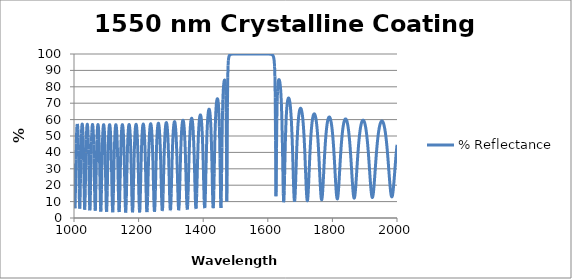
| Category | % Reflectance |
|---|---|
| 1000.0 | 32.933 |
| 1001.0 | 20.447 |
| 1002.0 | 9.538 |
| 1003.0 | 5.943 |
| 1004.0 | 12.063 |
| 1005.0 | 23.858 |
| 1006.0 | 35.874 |
| 1007.0 | 45.386 |
| 1008.0 | 51.915 |
| 1009.0 | 55.778 |
| 1010.0 | 57.343 |
| 1011.0 | 56.794 |
| 1012.0 | 54.082 |
| 1013.0 | 48.941 |
| 1014.0 | 41.01 |
| 1015.0 | 30.245 |
| 1016.0 | 17.946 |
| 1017.0 | 8.01 |
| 1018.0 | 5.721 |
| 1019.0 | 12.536 |
| 1020.0 | 24.26 |
| 1021.0 | 35.853 |
| 1022.0 | 45.064 |
| 1023.0 | 51.483 |
| 1024.0 | 55.394 |
| 1025.0 | 57.14 |
| 1026.0 | 56.908 |
| 1027.0 | 54.684 |
| 1028.0 | 50.263 |
| 1029.0 | 43.315 |
| 1030.0 | 33.656 |
| 1031.0 | 21.947 |
| 1032.0 | 10.844 |
| 1033.0 | 5.084 |
| 1034.0 | 8.019 |
| 1035.0 | 17.8 |
| 1036.0 | 29.614 |
| 1037.0 | 40.023 |
| 1038.0 | 47.848 |
| 1039.0 | 53.104 |
| 1040.0 | 56.118 |
| 1041.0 | 57.165 |
| 1042.0 | 56.388 |
| 1043.0 | 53.722 |
| 1044.0 | 48.94 |
| 1045.0 | 41.743 |
| 1046.0 | 32.031 |
| 1047.0 | 20.577 |
| 1048.0 | 10.005 |
| 1049.0 | 4.666 |
| 1050.0 | 7.494 |
| 1051.0 | 16.814 |
| 1052.0 | 28.268 |
| 1053.0 | 38.595 |
| 1054.0 | 46.56 |
| 1055.0 | 52.089 |
| 1056.0 | 55.464 |
| 1057.0 | 56.961 |
| 1058.0 | 56.723 |
| 1059.0 | 54.738 |
| 1060.0 | 50.843 |
| 1061.0 | 44.817 |
| 1062.0 | 36.427 |
| 1063.0 | 25.923 |
| 1064.0 | 14.794 |
| 1065.0 | 6.36 |
| 1066.0 | 4.477 |
| 1067.0 | 10.14 |
| 1068.0 | 20.407 |
| 1069.0 | 31.395 |
| 1070.0 | 40.797 |
| 1071.0 | 47.904 |
| 1072.0 | 52.787 |
| 1073.0 | 55.721 |
| 1074.0 | 56.937 |
| 1075.0 | 56.548 |
| 1076.0 | 54.527 |
| 1077.0 | 50.721 |
| 1078.0 | 44.885 |
| 1079.0 | 36.818 |
| 1080.0 | 26.712 |
| 1081.0 | 15.874 |
| 1082.0 | 7.075 |
| 1083.0 | 3.915 |
| 1084.0 | 7.968 |
| 1085.0 | 17.177 |
| 1086.0 | 27.933 |
| 1087.0 | 37.666 |
| 1088.0 | 45.359 |
| 1089.0 | 50.909 |
| 1090.0 | 54.534 |
| 1091.0 | 56.475 |
| 1092.0 | 56.888 |
| 1093.0 | 55.812 |
| 1094.0 | 53.173 |
| 1095.0 | 48.79 |
| 1096.0 | 42.435 |
| 1097.0 | 33.994 |
| 1098.0 | 23.842 |
| 1099.0 | 13.452 |
| 1100.0 | 5.725 |
| 1101.0 | 3.783 |
| 1102.0 | 8.146 |
| 1103.0 | 16.876 |
| 1104.0 | 26.977 |
| 1105.0 | 36.284 |
| 1106.0 | 43.854 |
| 1107.0 | 49.526 |
| 1108.0 | 53.452 |
| 1109.0 | 55.839 |
| 1110.0 | 56.848 |
| 1111.0 | 56.555 |
| 1112.0 | 54.946 |
| 1113.0 | 51.92 |
| 1114.0 | 47.308 |
| 1115.0 | 40.927 |
| 1116.0 | 32.731 |
| 1117.0 | 23.121 |
| 1118.0 | 13.395 |
| 1119.0 | 5.96 |
| 1120.0 | 3.483 |
| 1121.0 | 7.003 |
| 1122.0 | 15.013 |
| 1123.0 | 24.778 |
| 1124.0 | 34.108 |
| 1125.0 | 41.927 |
| 1126.0 | 47.958 |
| 1127.0 | 52.291 |
| 1128.0 | 55.118 |
| 1129.0 | 56.605 |
| 1130.0 | 56.854 |
| 1131.0 | 55.888 |
| 1132.0 | 53.651 |
| 1133.0 | 50.014 |
| 1134.0 | 44.807 |
| 1135.0 | 37.893 |
| 1136.0 | 29.348 |
| 1137.0 | 19.786 |
| 1138.0 | 10.741 |
| 1139.0 | 4.626 |
| 1140.0 | 3.651 |
| 1141.0 | 8.192 |
| 1142.0 | 16.478 |
| 1143.0 | 26.003 |
| 1144.0 | 34.922 |
| 1145.0 | 42.365 |
| 1146.0 | 48.128 |
| 1147.0 | 52.304 |
| 1148.0 | 55.069 |
| 1149.0 | 56.576 |
| 1150.0 | 56.922 |
| 1151.0 | 56.132 |
| 1152.0 | 54.166 |
| 1153.0 | 50.915 |
| 1154.0 | 46.229 |
| 1155.0 | 39.964 |
| 1156.0 | 32.114 |
| 1157.0 | 23.052 |
| 1158.0 | 13.869 |
| 1159.0 | 6.53 |
| 1160.0 | 3.306 |
| 1161.0 | 5.392 |
| 1162.0 | 11.967 |
| 1163.0 | 20.867 |
| 1164.0 | 30 |
| 1165.0 | 38.106 |
| 1166.0 | 44.696 |
| 1167.0 | 49.725 |
| 1168.0 | 53.321 |
| 1169.0 | 55.644 |
| 1170.0 | 56.822 |
| 1171.0 | 56.927 |
| 1172.0 | 55.969 |
| 1173.0 | 53.9 |
| 1174.0 | 50.615 |
| 1175.0 | 45.975 |
| 1176.0 | 39.851 |
| 1177.0 | 32.244 |
| 1178.0 | 23.491 |
| 1179.0 | 14.556 |
| 1180.0 | 7.182 |
| 1181.0 | 3.458 |
| 1182.0 | 4.671 |
| 1183.0 | 10.359 |
| 1184.0 | 18.679 |
| 1185.0 | 27.622 |
| 1186.0 | 35.837 |
| 1187.0 | 42.711 |
| 1188.0 | 48.108 |
| 1189.0 | 52.11 |
| 1190.0 | 54.864 |
| 1191.0 | 56.501 |
| 1192.0 | 57.111 |
| 1193.0 | 56.733 |
| 1194.0 | 55.35 |
| 1195.0 | 52.895 |
| 1196.0 | 49.257 |
| 1197.0 | 44.304 |
| 1198.0 | 37.944 |
| 1199.0 | 30.238 |
| 1200.0 | 21.615 |
| 1201.0 | 13.109 |
| 1202.0 | 6.42 |
| 1203.0 | 3.414 |
| 1204.0 | 5.082 |
| 1205.0 | 10.838 |
| 1206.0 | 18.954 |
| 1207.0 | 27.616 |
| 1208.0 | 35.601 |
| 1209.0 | 42.342 |
| 1210.0 | 47.7 |
| 1211.0 | 51.74 |
| 1212.0 | 54.593 |
| 1213.0 | 56.384 |
| 1214.0 | 57.204 |
| 1215.0 | 57.097 |
| 1216.0 | 56.064 |
| 1217.0 | 54.056 |
| 1218.0 | 50.985 |
| 1219.0 | 46.734 |
| 1220.0 | 41.194 |
| 1221.0 | 34.338 |
| 1222.0 | 26.364 |
| 1223.0 | 17.902 |
| 1224.0 | 10.184 |
| 1225.0 | 4.913 |
| 1226.0 | 3.6 |
| 1227.0 | 6.656 |
| 1228.0 | 13.113 |
| 1229.0 | 21.27 |
| 1230.0 | 29.588 |
| 1231.0 | 37.107 |
| 1232.0 | 43.412 |
| 1233.0 | 48.422 |
| 1234.0 | 52.212 |
| 1235.0 | 54.903 |
| 1236.0 | 56.607 |
| 1237.0 | 57.407 |
| 1238.0 | 57.344 |
| 1239.0 | 56.419 |
| 1240.0 | 54.59 |
| 1241.0 | 51.782 |
| 1242.0 | 47.89 |
| 1243.0 | 42.809 |
| 1244.0 | 36.487 |
| 1245.0 | 29.034 |
| 1246.0 | 20.888 |
| 1247.0 | 12.989 |
| 1248.0 | 6.782 |
| 1249.0 | 3.816 |
| 1250.0 | 4.963 |
| 1251.0 | 9.86 |
| 1252.0 | 17.16 |
| 1253.0 | 25.299 |
| 1254.0 | 33.106 |
| 1255.0 | 39.944 |
| 1256.0 | 45.586 |
| 1257.0 | 50.028 |
| 1258.0 | 53.362 |
| 1259.0 | 55.702 |
| 1260.0 | 57.144 |
| 1261.0 | 57.753 |
| 1262.0 | 57.56 |
| 1263.0 | 56.561 |
| 1264.0 | 54.713 |
| 1265.0 | 51.943 |
| 1266.0 | 48.154 |
| 1267.0 | 43.248 |
| 1268.0 | 37.176 |
| 1269.0 | 30.024 |
| 1270.0 | 22.16 |
| 1271.0 | 14.384 |
| 1272.0 | 7.97 |
| 1273.0 | 4.37 |
| 1274.0 | 4.568 |
| 1275.0 | 8.499 |
| 1276.0 | 15.095 |
| 1277.0 | 22.9 |
| 1278.0 | 30.695 |
| 1279.0 | 37.736 |
| 1280.0 | 43.696 |
| 1281.0 | 48.51 |
| 1282.0 | 52.238 |
| 1283.0 | 54.983 |
| 1284.0 | 56.842 |
| 1285.0 | 57.893 |
| 1286.0 | 58.182 |
| 1287.0 | 57.726 |
| 1288.0 | 56.506 |
| 1289.0 | 54.474 |
| 1290.0 | 51.555 |
| 1291.0 | 47.656 |
| 1292.0 | 42.688 |
| 1293.0 | 36.618 |
| 1294.0 | 29.55 |
| 1295.0 | 21.86 |
| 1296.0 | 14.326 |
| 1297.0 | 8.15 |
| 1298.0 | 4.677 |
| 1299.0 | 4.816 |
| 1300.0 | 8.526 |
| 1301.0 | 14.842 |
| 1302.0 | 22.416 |
| 1303.0 | 30.077 |
| 1304.0 | 37.086 |
| 1305.0 | 43.096 |
| 1306.0 | 48.018 |
| 1307.0 | 51.894 |
| 1308.0 | 54.816 |
| 1309.0 | 56.88 |
| 1310.0 | 58.164 |
| 1311.0 | 58.724 |
| 1312.0 | 58.582 |
| 1313.0 | 57.736 |
| 1314.0 | 56.152 |
| 1315.0 | 53.771 |
| 1316.0 | 50.512 |
| 1317.0 | 46.282 |
| 1318.0 | 41.011 |
| 1319.0 | 34.7 |
| 1320.0 | 27.518 |
| 1321.0 | 19.925 |
| 1322.0 | 12.783 |
| 1323.0 | 7.306 |
| 1324.0 | 4.717 |
| 1325.0 | 5.693 |
| 1326.0 | 9.976 |
| 1327.0 | 16.528 |
| 1328.0 | 24.068 |
| 1329.0 | 31.553 |
| 1330.0 | 38.344 |
| 1331.0 | 44.153 |
| 1332.0 | 48.916 |
| 1333.0 | 52.683 |
| 1334.0 | 55.543 |
| 1335.0 | 57.588 |
| 1336.0 | 58.893 |
| 1337.0 | 59.511 |
| 1338.0 | 59.468 |
| 1339.0 | 58.764 |
| 1340.0 | 57.37 |
| 1341.0 | 55.233 |
| 1342.0 | 52.277 |
| 1343.0 | 48.414 |
| 1344.0 | 43.558 |
| 1345.0 | 37.676 |
| 1346.0 | 30.852 |
| 1347.0 | 23.404 |
| 1348.0 | 16.004 |
| 1349.0 | 9.715 |
| 1350.0 | 5.79 |
| 1351.0 | 5.194 |
| 1352.0 | 8.096 |
| 1353.0 | 13.772 |
| 1354.0 | 21.004 |
| 1355.0 | 28.62 |
| 1356.0 | 35.802 |
| 1357.0 | 42.117 |
| 1358.0 | 47.415 |
| 1359.0 | 51.701 |
| 1360.0 | 55.052 |
| 1361.0 | 57.563 |
| 1362.0 | 59.321 |
| 1363.0 | 60.391 |
| 1364.0 | 60.818 |
| 1365.0 | 60.617 |
| 1366.0 | 59.781 |
| 1367.0 | 58.274 |
| 1368.0 | 56.037 |
| 1369.0 | 52.987 |
| 1370.0 | 49.029 |
| 1371.0 | 44.073 |
| 1372.0 | 38.079 |
| 1373.0 | 31.132 |
| 1374.0 | 23.564 |
| 1375.0 | 16.08 |
| 1376.0 | 9.791 |
| 1377.0 | 6.004 |
| 1378.0 | 5.691 |
| 1379.0 | 8.968 |
| 1380.0 | 15.019 |
| 1381.0 | 22.553 |
| 1382.0 | 30.371 |
| 1383.0 | 37.664 |
| 1384.0 | 44.029 |
| 1385.0 | 49.34 |
| 1386.0 | 53.624 |
| 1387.0 | 56.971 |
| 1388.0 | 59.485 |
| 1389.0 | 61.257 |
| 1390.0 | 62.358 |
| 1391.0 | 62.832 |
| 1392.0 | 62.698 |
| 1393.0 | 61.946 |
| 1394.0 | 60.54 |
| 1395.0 | 58.416 |
| 1396.0 | 55.482 |
| 1397.0 | 51.628 |
| 1398.0 | 46.735 |
| 1399.0 | 40.721 |
| 1400.0 | 33.618 |
| 1401.0 | 25.706 |
| 1402.0 | 17.683 |
| 1403.0 | 10.763 |
| 1404.0 | 6.476 |
| 1405.0 | 6.048 |
| 1406.0 | 9.68 |
| 1407.0 | 16.408 |
| 1408.0 | 24.689 |
| 1409.0 | 33.134 |
| 1410.0 | 40.868 |
| 1411.0 | 47.495 |
| 1412.0 | 52.937 |
| 1413.0 | 57.267 |
| 1414.0 | 60.611 |
| 1415.0 | 63.098 |
| 1416.0 | 64.834 |
| 1417.0 | 65.898 |
| 1418.0 | 66.336 |
| 1419.0 | 66.164 |
| 1420.0 | 65.362 |
| 1421.0 | 63.88 |
| 1422.0 | 61.628 |
| 1423.0 | 58.479 |
| 1424.0 | 54.264 |
| 1425.0 | 48.797 |
| 1426.0 | 41.923 |
| 1427.0 | 33.651 |
| 1428.0 | 24.396 |
| 1429.0 | 15.31 |
| 1430.0 | 8.418 |
| 1431.0 | 5.999 |
| 1432.0 | 9.17 |
| 1433.0 | 16.953 |
| 1434.0 | 27.022 |
| 1435.0 | 37.201 |
| 1436.0 | 46.232 |
| 1437.0 | 53.676 |
| 1438.0 | 59.557 |
| 1439.0 | 64.071 |
| 1440.0 | 67.446 |
| 1441.0 | 69.878 |
| 1442.0 | 71.513 |
| 1443.0 | 72.446 |
| 1444.0 | 72.725 |
| 1445.0 | 72.346 |
| 1446.0 | 71.253 |
| 1447.0 | 69.328 |
| 1448.0 | 66.366 |
| 1449.0 | 62.058 |
| 1450.0 | 55.969 |
| 1451.0 | 47.57 |
| 1452.0 | 36.486 |
| 1453.0 | 23.305 |
| 1454.0 | 11.144 |
| 1455.0 | 6.143 |
| 1456.0 | 12.606 |
| 1457.0 | 27.203 |
| 1458.0 | 43.022 |
| 1459.0 | 56.09 |
| 1460.0 | 65.709 |
| 1461.0 | 72.478 |
| 1462.0 | 77.158 |
| 1463.0 | 80.344 |
| 1464.0 | 82.433 |
| 1465.0 | 83.663 |
| 1466.0 | 84.141 |
| 1467.0 | 83.851 |
| 1468.0 | 82.612 |
| 1469.0 | 79.961 |
| 1470.0 | 74.809 |
| 1471.0 | 64.53 |
| 1472.0 | 43.111 |
| 1473.0 | 10.136 |
| 1474.0 | 25.559 |
| 1475.0 | 67.353 |
| 1476.0 | 85.844 |
| 1477.0 | 93.027 |
| 1478.0 | 96.17 |
| 1479.0 | 97.72 |
| 1480.0 | 98.557 |
| 1481.0 | 99.043 |
| 1482.0 | 99.341 |
| 1483.0 | 99.532 |
| 1484.0 | 99.659 |
| 1485.0 | 99.746 |
| 1486.0 | 99.808 |
| 1487.0 | 99.852 |
| 1488.0 | 99.884 |
| 1489.0 | 99.908 |
| 1490.0 | 99.926 |
| 1491.0 | 99.94 |
| 1492.0 | 99.951 |
| 1493.0 | 99.959 |
| 1494.0 | 99.966 |
| 1495.0 | 99.972 |
| 1496.0 | 99.976 |
| 1497.0 | 99.98 |
| 1498.0 | 99.982 |
| 1499.0 | 99.985 |
| 1500.0 | 99.987 |
| 1501.0 | 99.988 |
| 1502.0 | 99.99 |
| 1503.0 | 99.991 |
| 1504.0 | 99.992 |
| 1505.0 | 99.993 |
| 1506.0 | 99.994 |
| 1507.0 | 99.994 |
| 1508.0 | 99.995 |
| 1509.0 | 99.995 |
| 1510.0 | 99.996 |
| 1511.0 | 99.996 |
| 1512.0 | 99.996 |
| 1513.0 | 99.997 |
| 1514.0 | 99.997 |
| 1515.0 | 99.997 |
| 1516.0 | 99.997 |
| 1517.0 | 99.998 |
| 1518.0 | 99.998 |
| 1519.0 | 99.998 |
| 1520.0 | 99.998 |
| 1521.0 | 99.998 |
| 1522.0 | 99.998 |
| 1523.0 | 99.998 |
| 1524.0 | 99.998 |
| 1525.0 | 99.998 |
| 1526.0 | 99.998 |
| 1527.0 | 99.998 |
| 1528.0 | 99.999 |
| 1529.0 | 99.999 |
| 1530.0 | 99.999 |
| 1531.0 | 99.999 |
| 1532.0 | 99.999 |
| 1533.0 | 99.999 |
| 1534.0 | 99.999 |
| 1535.0 | 99.999 |
| 1536.0 | 99.999 |
| 1537.0 | 99.999 |
| 1538.0 | 99.999 |
| 1539.0 | 99.999 |
| 1540.0 | 99.999 |
| 1541.0 | 99.999 |
| 1542.0 | 99.999 |
| 1543.0 | 99.999 |
| 1544.0 | 99.999 |
| 1545.0 | 99.999 |
| 1546.0 | 99.999 |
| 1547.0 | 99.999 |
| 1548.0 | 99.999 |
| 1549.0 | 99.999 |
| 1550.0 | 99.999 |
| 1551.0 | 99.999 |
| 1552.0 | 99.999 |
| 1553.0 | 99.999 |
| 1554.0 | 99.999 |
| 1555.0 | 99.999 |
| 1556.0 | 99.999 |
| 1557.0 | 99.999 |
| 1558.0 | 99.999 |
| 1559.0 | 99.999 |
| 1560.0 | 99.999 |
| 1561.0 | 99.999 |
| 1562.0 | 99.999 |
| 1563.0 | 99.999 |
| 1564.0 | 99.998 |
| 1565.0 | 99.998 |
| 1566.0 | 99.998 |
| 1567.0 | 99.998 |
| 1568.0 | 99.998 |
| 1569.0 | 99.998 |
| 1570.0 | 99.998 |
| 1571.0 | 99.998 |
| 1572.0 | 99.998 |
| 1573.0 | 99.998 |
| 1574.0 | 99.998 |
| 1575.0 | 99.997 |
| 1576.0 | 99.997 |
| 1577.0 | 99.997 |
| 1578.0 | 99.997 |
| 1579.0 | 99.996 |
| 1580.0 | 99.996 |
| 1581.0 | 99.996 |
| 1582.0 | 99.996 |
| 1583.0 | 99.995 |
| 1584.0 | 99.995 |
| 1585.0 | 99.994 |
| 1586.0 | 99.994 |
| 1587.0 | 99.993 |
| 1588.0 | 99.992 |
| 1589.0 | 99.992 |
| 1590.0 | 99.991 |
| 1591.0 | 99.99 |
| 1592.0 | 99.988 |
| 1593.0 | 99.987 |
| 1594.0 | 99.985 |
| 1595.0 | 99.983 |
| 1596.0 | 99.981 |
| 1597.0 | 99.978 |
| 1598.0 | 99.975 |
| 1599.0 | 99.971 |
| 1600.0 | 99.967 |
| 1601.0 | 99.961 |
| 1602.0 | 99.955 |
| 1603.0 | 99.946 |
| 1604.0 | 99.937 |
| 1605.0 | 99.924 |
| 1606.0 | 99.909 |
| 1607.0 | 99.89 |
| 1608.0 | 99.866 |
| 1609.0 | 99.835 |
| 1610.0 | 99.794 |
| 1611.0 | 99.742 |
| 1612.0 | 99.671 |
| 1613.0 | 99.575 |
| 1614.0 | 99.443 |
| 1615.0 | 99.257 |
| 1616.0 | 98.988 |
| 1617.0 | 98.587 |
| 1618.0 | 97.968 |
| 1619.0 | 96.972 |
| 1620.0 | 95.281 |
| 1621.0 | 92.216 |
| 1622.0 | 86.216 |
| 1623.0 | 73.55 |
| 1624.0 | 47.198 |
| 1625.0 | 13.263 |
| 1626.0 | 16.514 |
| 1627.0 | 42.531 |
| 1628.0 | 60.844 |
| 1629.0 | 71.162 |
| 1630.0 | 77.043 |
| 1631.0 | 80.517 |
| 1632.0 | 82.587 |
| 1633.0 | 83.764 |
| 1634.0 | 84.308 |
| 1635.0 | 84.356 |
| 1636.0 | 83.966 |
| 1637.0 | 83.144 |
| 1638.0 | 81.858 |
| 1639.0 | 80.03 |
| 1640.0 | 77.543 |
| 1641.0 | 74.221 |
| 1642.0 | 69.832 |
| 1643.0 | 64.084 |
| 1644.0 | 56.663 |
| 1645.0 | 47.367 |
| 1646.0 | 36.391 |
| 1647.0 | 24.815 |
| 1648.0 | 14.933 |
| 1649.0 | 9.631 |
| 1650.0 | 10.542 |
| 1651.0 | 16.758 |
| 1652.0 | 25.756 |
| 1653.0 | 35.191 |
| 1654.0 | 43.727 |
| 1655.0 | 50.887 |
| 1656.0 | 56.663 |
| 1657.0 | 61.224 |
| 1658.0 | 64.779 |
| 1659.0 | 67.515 |
| 1660.0 | 69.586 |
| 1661.0 | 71.107 |
| 1662.0 | 72.165 |
| 1663.0 | 72.821 |
| 1664.0 | 73.117 |
| 1665.0 | 73.075 |
| 1666.0 | 72.706 |
| 1667.0 | 72.006 |
| 1668.0 | 70.96 |
| 1669.0 | 69.54 |
| 1670.0 | 67.707 |
| 1671.0 | 65.409 |
| 1672.0 | 62.585 |
| 1673.0 | 59.166 |
| 1674.0 | 55.083 |
| 1675.0 | 50.279 |
| 1676.0 | 44.739 |
| 1677.0 | 38.525 |
| 1678.0 | 31.832 |
| 1679.0 | 25.042 |
| 1680.0 | 18.749 |
| 1681.0 | 13.7 |
| 1682.0 | 10.625 |
| 1683.0 | 9.997 |
| 1684.0 | 11.842 |
| 1685.0 | 15.744 |
| 1686.0 | 21.02 |
| 1687.0 | 26.954 |
| 1688.0 | 32.967 |
| 1689.0 | 38.667 |
| 1690.0 | 43.839 |
| 1691.0 | 48.394 |
| 1692.0 | 52.322 |
| 1693.0 | 55.656 |
| 1694.0 | 58.447 |
| 1695.0 | 60.752 |
| 1696.0 | 62.624 |
| 1697.0 | 64.11 |
| 1698.0 | 65.249 |
| 1699.0 | 66.074 |
| 1700.0 | 66.607 |
| 1701.0 | 66.866 |
| 1702.0 | 66.862 |
| 1703.0 | 66.596 |
| 1704.0 | 66.069 |
| 1705.0 | 65.273 |
| 1706.0 | 64.194 |
| 1707.0 | 62.815 |
| 1708.0 | 61.113 |
| 1709.0 | 59.061 |
| 1710.0 | 56.63 |
| 1711.0 | 53.79 |
| 1712.0 | 50.516 |
| 1713.0 | 46.793 |
| 1714.0 | 42.625 |
| 1715.0 | 38.052 |
| 1716.0 | 33.163 |
| 1717.0 | 28.114 |
| 1718.0 | 23.139 |
| 1719.0 | 18.552 |
| 1720.0 | 14.716 |
| 1721.0 | 11.99 |
| 1722.0 | 10.656 |
| 1723.0 | 10.845 |
| 1724.0 | 12.507 |
| 1725.0 | 15.425 |
| 1726.0 | 19.273 |
| 1727.0 | 23.694 |
| 1728.0 | 28.36 |
| 1729.0 | 33.008 |
| 1730.0 | 37.454 |
| 1731.0 | 41.579 |
| 1732.0 | 45.322 |
| 1733.0 | 48.659 |
| 1734.0 | 51.593 |
| 1735.0 | 54.14 |
| 1736.0 | 56.323 |
| 1737.0 | 58.17 |
| 1738.0 | 59.707 |
| 1739.0 | 60.957 |
| 1740.0 | 61.941 |
| 1741.0 | 62.676 |
| 1742.0 | 63.177 |
| 1743.0 | 63.453 |
| 1744.0 | 63.51 |
| 1745.0 | 63.352 |
| 1746.0 | 62.978 |
| 1747.0 | 62.384 |
| 1748.0 | 61.564 |
| 1749.0 | 60.508 |
| 1750.0 | 59.204 |
| 1751.0 | 57.636 |
| 1752.0 | 55.788 |
| 1753.0 | 53.645 |
| 1754.0 | 51.189 |
| 1755.0 | 48.409 |
| 1756.0 | 45.3 |
| 1757.0 | 41.868 |
| 1758.0 | 38.141 |
| 1759.0 | 34.17 |
| 1760.0 | 30.039 |
| 1761.0 | 25.877 |
| 1762.0 | 21.852 |
| 1763.0 | 18.17 |
| 1764.0 | 15.062 |
| 1765.0 | 12.749 |
| 1766.0 | 11.413 |
| 1767.0 | 11.16 |
| 1768.0 | 12.002 |
| 1769.0 | 13.85 |
| 1770.0 | 16.541 |
| 1771.0 | 19.861 |
| 1772.0 | 23.587 |
| 1773.0 | 27.51 |
| 1774.0 | 31.457 |
| 1775.0 | 35.295 |
| 1776.0 | 38.932 |
| 1777.0 | 42.31 |
| 1778.0 | 45.395 |
| 1779.0 | 48.176 |
| 1780.0 | 50.654 |
| 1781.0 | 52.837 |
| 1782.0 | 54.739 |
| 1783.0 | 56.376 |
| 1784.0 | 57.764 |
| 1785.0 | 58.917 |
| 1786.0 | 59.85 |
| 1787.0 | 60.575 |
| 1788.0 | 61.1 |
| 1789.0 | 61.434 |
| 1790.0 | 61.581 |
| 1791.0 | 61.544 |
| 1792.0 | 61.325 |
| 1793.0 | 60.922 |
| 1794.0 | 60.331 |
| 1795.0 | 59.548 |
| 1796.0 | 58.565 |
| 1797.0 | 57.372 |
| 1798.0 | 55.962 |
| 1799.0 | 54.321 |
| 1800.0 | 52.44 |
| 1801.0 | 50.309 |
| 1802.0 | 47.919 |
| 1803.0 | 45.269 |
| 1804.0 | 42.363 |
| 1805.0 | 39.216 |
| 1806.0 | 35.857 |
| 1807.0 | 32.337 |
| 1808.0 | 28.728 |
| 1809.0 | 25.13 |
| 1810.0 | 21.667 |
| 1811.0 | 18.488 |
| 1812.0 | 15.753 |
| 1813.0 | 13.619 |
| 1814.0 | 12.22 |
| 1815.0 | 11.647 |
| 1816.0 | 11.937 |
| 1817.0 | 13.061 |
| 1818.0 | 14.934 |
| 1819.0 | 17.428 |
| 1820.0 | 20.391 |
| 1821.0 | 23.664 |
| 1822.0 | 27.101 |
| 1823.0 | 30.577 |
| 1824.0 | 33.991 |
| 1825.0 | 37.268 |
| 1826.0 | 40.357 |
| 1827.0 | 43.225 |
| 1828.0 | 45.856 |
| 1829.0 | 48.242 |
| 1830.0 | 50.384 |
| 1831.0 | 52.29 |
| 1832.0 | 53.968 |
| 1833.0 | 55.428 |
| 1834.0 | 56.681 |
| 1835.0 | 57.738 |
| 1836.0 | 58.609 |
| 1837.0 | 59.302 |
| 1838.0 | 59.824 |
| 1839.0 | 60.181 |
| 1840.0 | 60.376 |
| 1841.0 | 60.414 |
| 1842.0 | 60.294 |
| 1843.0 | 60.016 |
| 1844.0 | 59.58 |
| 1845.0 | 58.981 |
| 1846.0 | 58.216 |
| 1847.0 | 57.278 |
| 1848.0 | 56.161 |
| 1849.0 | 54.858 |
| 1850.0 | 53.361 |
| 1851.0 | 51.663 |
| 1852.0 | 49.756 |
| 1853.0 | 47.636 |
| 1854.0 | 45.302 |
| 1855.0 | 42.755 |
| 1856.0 | 40.007 |
| 1857.0 | 37.077 |
| 1858.0 | 33.996 |
| 1859.0 | 30.812 |
| 1860.0 | 27.586 |
| 1861.0 | 24.402 |
| 1862.0 | 21.356 |
| 1863.0 | 18.563 |
| 1864.0 | 16.141 |
| 1865.0 | 14.206 |
| 1866.0 | 12.861 |
| 1867.0 | 12.178 |
| 1868.0 | 12.195 |
| 1869.0 | 12.907 |
| 1870.0 | 14.267 |
| 1871.0 | 16.194 |
| 1872.0 | 18.584 |
| 1873.0 | 21.322 |
| 1874.0 | 24.289 |
| 1875.0 | 27.38 |
| 1876.0 | 30.5 |
| 1877.0 | 33.575 |
| 1878.0 | 36.546 |
| 1879.0 | 39.37 |
| 1880.0 | 42.019 |
| 1881.0 | 44.477 |
| 1882.0 | 46.734 |
| 1883.0 | 48.789 |
| 1884.0 | 50.642 |
| 1885.0 | 52.3 |
| 1886.0 | 53.769 |
| 1887.0 | 55.057 |
| 1888.0 | 56.172 |
| 1889.0 | 57.121 |
| 1890.0 | 57.911 |
| 1891.0 | 58.548 |
| 1892.0 | 59.039 |
| 1893.0 | 59.386 |
| 1894.0 | 59.594 |
| 1895.0 | 59.665 |
| 1896.0 | 59.6 |
| 1897.0 | 59.398 |
| 1898.0 | 59.06 |
| 1899.0 | 58.582 |
| 1900.0 | 57.963 |
| 1901.0 | 57.198 |
| 1902.0 | 56.284 |
| 1903.0 | 55.214 |
| 1904.0 | 53.983 |
| 1905.0 | 52.586 |
| 1906.0 | 51.016 |
| 1907.0 | 49.27 |
| 1908.0 | 47.345 |
| 1909.0 | 45.238 |
| 1910.0 | 42.954 |
| 1911.0 | 40.5 |
| 1912.0 | 37.888 |
| 1913.0 | 35.142 |
| 1914.0 | 32.293 |
| 1915.0 | 29.385 |
| 1916.0 | 26.473 |
| 1917.0 | 23.626 |
| 1918.0 | 20.924 |
| 1919.0 | 18.455 |
| 1920.0 | 16.31 |
| 1921.0 | 14.58 |
| 1922.0 | 13.339 |
| 1923.0 | 12.646 |
| 1924.0 | 12.534 |
| 1925.0 | 13.006 |
| 1926.0 | 14.034 |
| 1927.0 | 15.565 |
| 1928.0 | 17.528 |
| 1929.0 | 19.835 |
| 1930.0 | 22.398 |
| 1931.0 | 25.127 |
| 1932.0 | 27.943 |
| 1933.0 | 30.776 |
| 1934.0 | 33.568 |
| 1935.0 | 36.275 |
| 1936.0 | 38.864 |
| 1937.0 | 41.309 |
| 1938.0 | 43.596 |
| 1939.0 | 45.717 |
| 1940.0 | 47.666 |
| 1941.0 | 49.446 |
| 1942.0 | 51.057 |
| 1943.0 | 52.504 |
| 1944.0 | 53.794 |
| 1945.0 | 54.93 |
| 1946.0 | 55.92 |
| 1947.0 | 56.768 |
| 1948.0 | 57.481 |
| 1949.0 | 58.062 |
| 1950.0 | 58.516 |
| 1951.0 | 58.847 |
| 1952.0 | 59.056 |
| 1953.0 | 59.147 |
| 1954.0 | 59.118 |
| 1955.0 | 58.972 |
| 1956.0 | 58.707 |
| 1957.0 | 58.323 |
| 1958.0 | 57.817 |
| 1959.0 | 57.187 |
| 1960.0 | 56.429 |
| 1961.0 | 55.541 |
| 1962.0 | 54.517 |
| 1963.0 | 53.355 |
| 1964.0 | 52.048 |
| 1965.0 | 50.594 |
| 1966.0 | 48.99 |
| 1967.0 | 47.232 |
| 1968.0 | 45.32 |
| 1969.0 | 43.258 |
| 1970.0 | 41.049 |
| 1971.0 | 38.704 |
| 1972.0 | 36.239 |
| 1973.0 | 33.675 |
| 1974.0 | 31.043 |
| 1975.0 | 28.382 |
| 1976.0 | 25.738 |
| 1977.0 | 23.17 |
| 1978.0 | 20.742 |
| 1979.0 | 18.522 |
| 1980.0 | 16.584 |
| 1981.0 | 14.995 |
| 1982.0 | 13.816 |
| 1983.0 | 13.094 |
| 1984.0 | 12.857 |
| 1985.0 | 13.115 |
| 1986.0 | 13.853 |
| 1987.0 | 15.039 |
| 1988.0 | 16.622 |
| 1989.0 | 18.54 |
| 1990.0 | 20.725 |
| 1991.0 | 23.107 |
| 1992.0 | 25.616 |
| 1993.0 | 28.193 |
| 1994.0 | 30.783 |
| 1995.0 | 33.341 |
| 1996.0 | 35.831 |
| 1997.0 | 38.226 |
| 1998.0 | 40.504 |
| 1999.0 | 42.651 |
| 2000.0 | 44.66 |